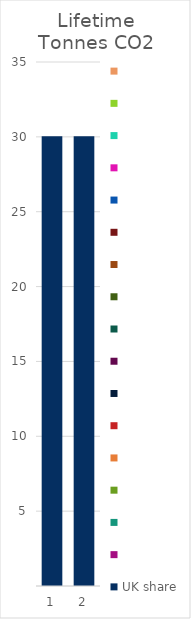
| Category | UK share | Series 1 | Series 2 | Series 3 | Series 4 | Series 5 | Series 6 | Series 7 | Series 8 | Series 9 | Series 10 | Series 11 | Series 12 | Series 13 | Series 14 | Series 15 | Series 16 |
|---|---|---|---|---|---|---|---|---|---|---|---|---|---|---|---|---|---|
| 0 | 30.046 | 0 | 0 | 0 | 0 | 0 | 0 | 0 | 0 | 0 | 0 | 0 | 0 | 0 | 0 | 0 | 0 |
| 1 | 30.046 | 0 | 0 | 0 | 0 | 0 | 0 | 0 | 0 | 0 | 0 | 0 | 0 | 0 | 0 | 0 | 0 |